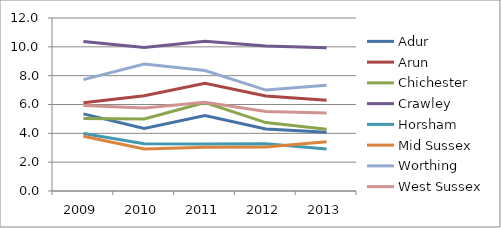
| Category | Adur | Arun | Chichester | Crawley | Horsham | Mid Sussex | Worthing | West Sussex |
|---|---|---|---|---|---|---|---|---|
| 2009.0 | 5.348 | 6.128 | 5.027 | 10.369 | 3.984 | 3.802 | 7.724 | 5.93 |
| 2010.0 | 4.337 | 6.608 | 4.991 | 9.958 | 3.284 | 2.918 | 8.8 | 5.756 |
| 2011.0 | 5.234 | 7.476 | 6.141 | 10.387 | 3.254 | 3.039 | 8.353 | 6.161 |
| 2012.0 | 4.304 | 6.595 | 4.746 | 10.06 | 3.284 | 3.046 | 7 | 5.518 |
| 2013.0 | 4.076 | 6.288 | 4.281 | 9.939 | 2.912 | 3.424 | 7.343 | 5.412 |